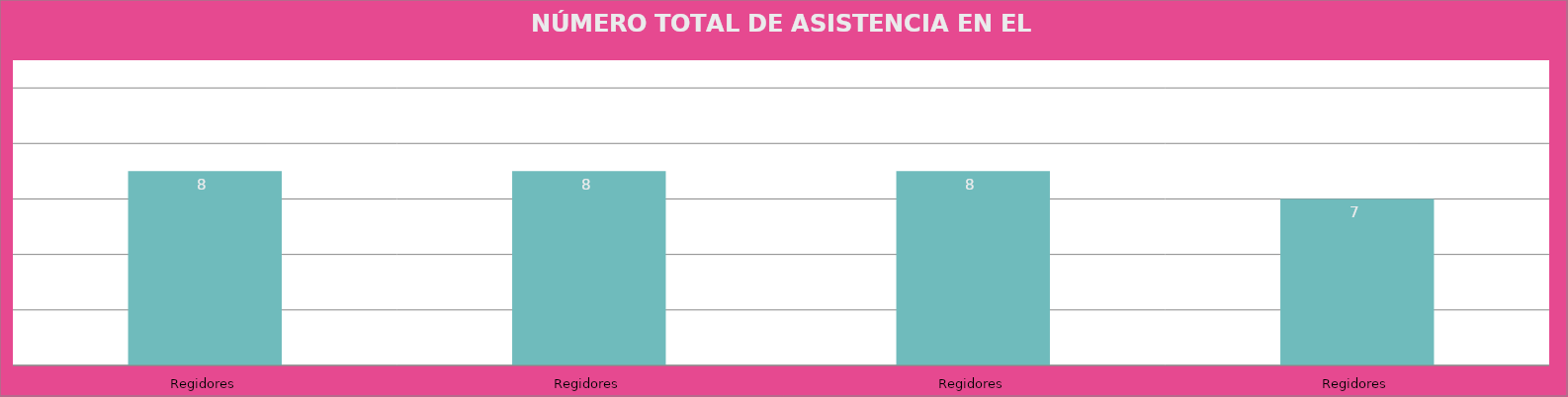
| Category | Regidores |
|---|---|
| Regidores | 8 |
| Regidores | 8 |
| Regidores | 8 |
| Regidores | 7 |